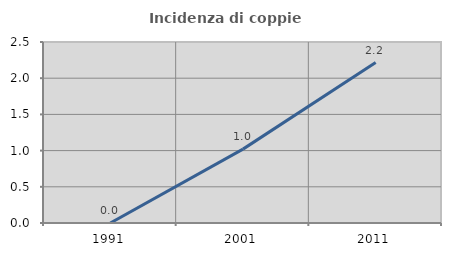
| Category | Incidenza di coppie miste |
|---|---|
| 1991.0 | 0 |
| 2001.0 | 1.02 |
| 2011.0 | 2.216 |